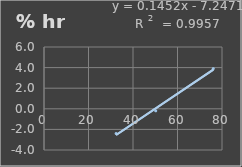
| Category | Humedad |
|---|---|
| 32.4 | -2.4 |
| 50.2 | -0.2 |
| 76.1 | 3.9 |